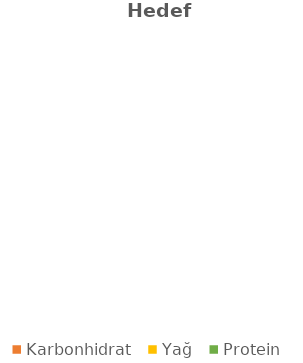
| Category | 0 |
|---|---|
| Karbonhidrat | 0 |
| Yağ | 0 |
| Protein | 0 |